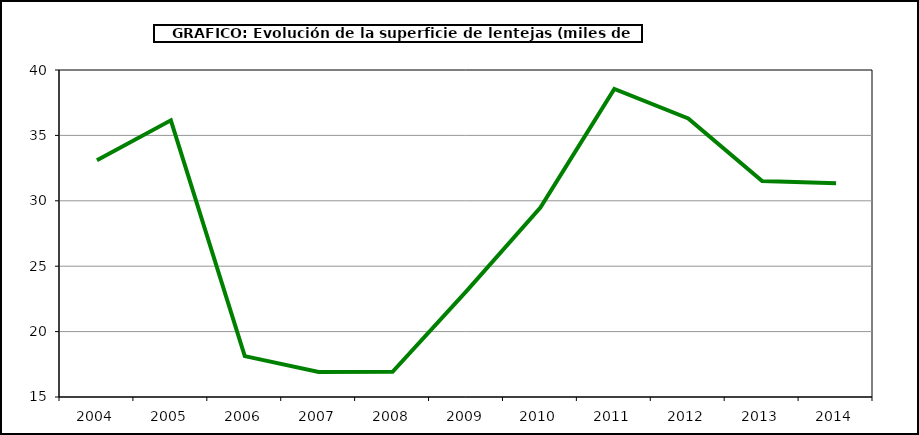
| Category | Superficie |
|---|---|
| 2004.0 | 33.103 |
| 2005.0 | 36.151 |
| 2006.0 | 18.125 |
| 2007.0 | 16.913 |
| 2008.0 | 16.932 |
| 2009.0 | 23.088 |
| 2010.0 | 29.478 |
| 2011.0 | 38.55 |
| 2012.0 | 36.298 |
| 2013.0 | 31.506 |
| 2014.0 | 31.35 |